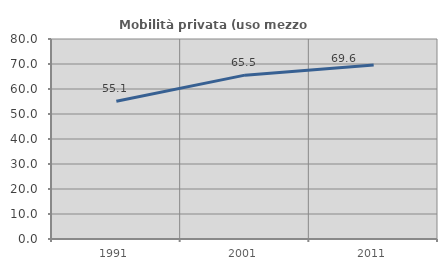
| Category | Mobilità privata (uso mezzo privato) |
|---|---|
| 1991.0 | 55.128 |
| 2001.0 | 65.546 |
| 2011.0 | 69.568 |